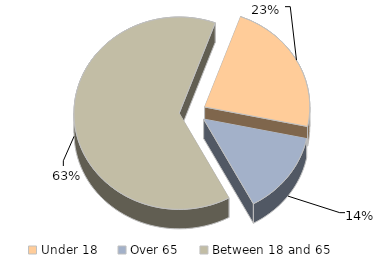
| Category | Series 0 |
|---|---|
| Under 18  | 0.227 |
| Over 65  | 0.139 |
| Between 18 and 65 | 0.634 |